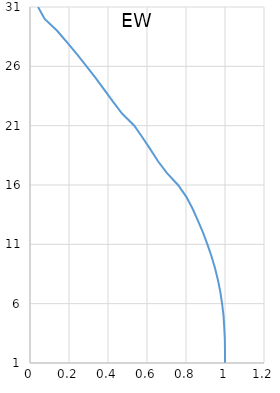
| Category | Series 0 |
|---|---|
| 0.04147968048070267 | 31 |
| 0.07510326554737319 | 30 |
| 0.139332137351254 | 29 |
| 0.19122191983776443 | 28 |
| 0.24153487599201154 | 27 |
| 0.2902112687431452 | 26 |
| 0.33724958696422064 | 25 |
| 0.3824440530513653 | 24 |
| 0.4263974120846325 | 23 |
| 0.47310708318526085 | 22 |
| 0.5348659742914107 | 21 |
| 0.5769202492371249 | 20 |
| 0.6174779757533693 | 19 |
| 0.6565565196305562 | 18 |
| 0.7025392436548342 | 17 |
| 0.7591529213118086 | 16 |
| 0.8018339812575268 | 15 |
| 0.8339041582771579 | 14 |
| 0.8610273392021123 | 13 |
| 0.8869049673779 | 12 |
| 0.9098124392044837 | 11 |
| 0.9306960780626232 | 10 |
| 0.9486058276840658 | 9 |
| 0.9636789220470522 | 8 |
| 0.976000110534134 | 7 |
| 0.9850784757945139 | 6 |
| 0.9923965612682306 | 5 |
| 0.9961808051432639 | 4 |
| 0.9991338041770979 | 3 |
| 1.0 | 2 |
| 1.0 | 1 |